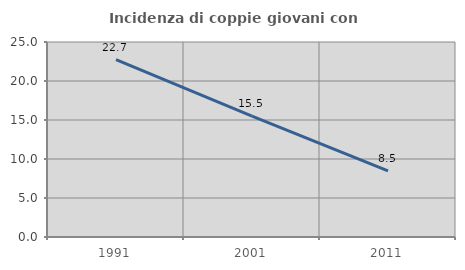
| Category | Incidenza di coppie giovani con figli |
|---|---|
| 1991.0 | 22.73 |
| 2001.0 | 15.486 |
| 2011.0 | 8.484 |